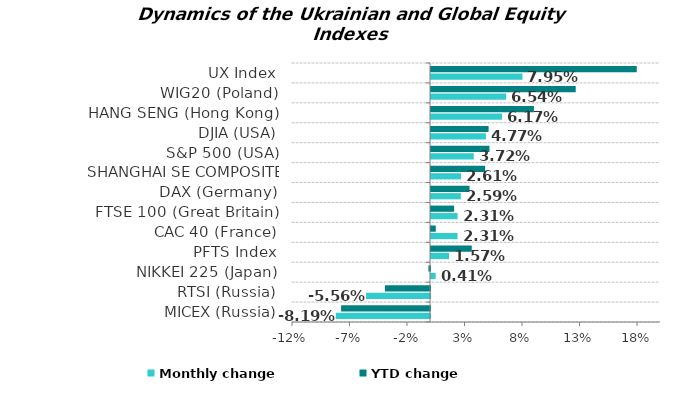
| Category | Monthly change | YTD change |
|---|---|---|
| MICEX (Russia) | -0.082 | -0.077 |
| RTSI (Russia) | -0.056 | -0.039 |
| NIKKEI 225 (Japan) | 0.004 | -0.001 |
| PFTS Index | 0.016 | 0.035 |
| CAC 40 (France) | 0.023 | 0.004 |
| FTSE 100 (Great Britain) | 0.023 | 0.02 |
| DAX (Germany) | 0.026 | 0.033 |
| SHANGHAI SE COMPOSITE (China) | 0.026 | 0.047 |
| S&P 500 (USA) | 0.037 | 0.051 |
| DJIA (USA) | 0.048 | 0.05 |
| HANG SENG (Hong Kong) | 0.062 | 0.089 |
| WIG20 (Poland) | 0.065 | 0.126 |
| UX Index | 0.08 | 0.179 |